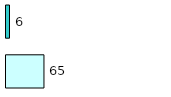
| Category | Series 0 | Series 1 |
|---|---|---|
| 0 | 65 | 6 |